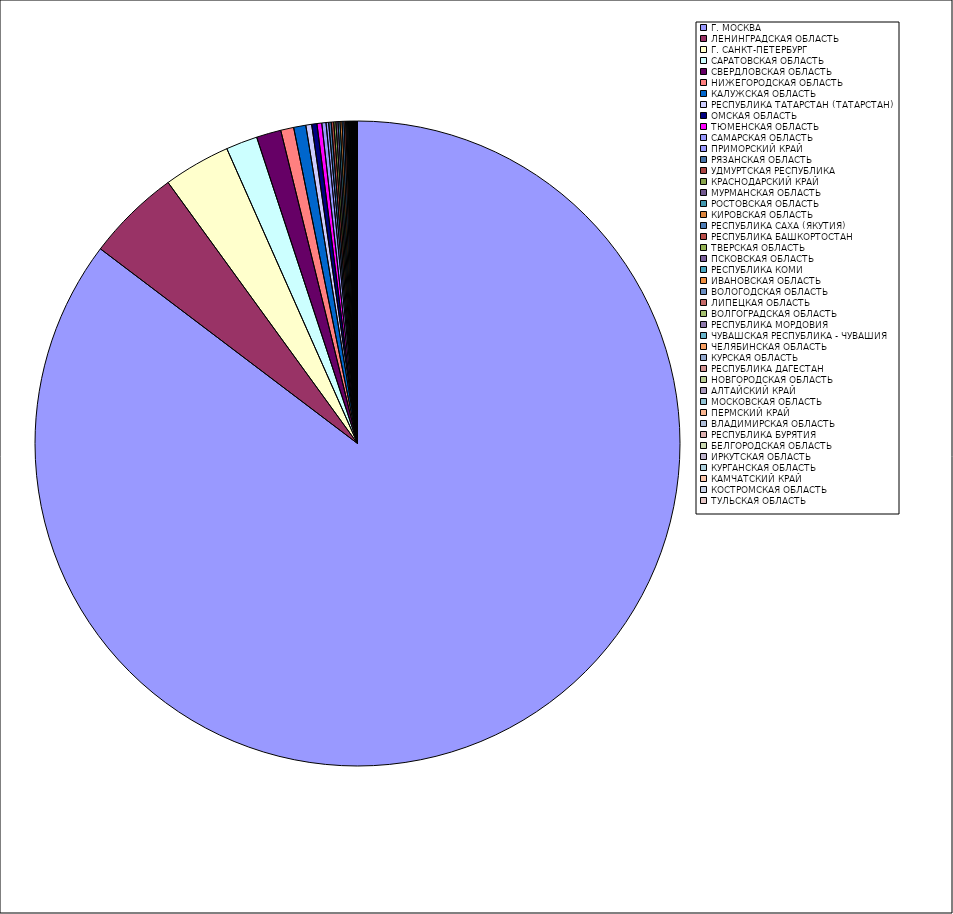
| Category | Оборот |
|---|---|
| Г. МОСКВА | 85.295 |
| ЛЕНИНГРАДСКАЯ ОБЛАСТЬ | 4.692 |
| Г. САНКТ-ПЕТЕРБУРГ | 3.353 |
| САРАТОВСКАЯ ОБЛАСТЬ | 1.578 |
| СВЕРДЛОВСКАЯ ОБЛАСТЬ | 1.235 |
| НИЖЕГОРОДСКАЯ ОБЛАСТЬ | 0.651 |
| КАЛУЖСКАЯ ОБЛАСТЬ | 0.61 |
| РЕСПУБЛИКА ТАТАРСТАН (ТАТАРСТАН) | 0.293 |
| ОМСКАЯ ОБЛАСТЬ | 0.263 |
| ТЮМЕНСКАЯ ОБЛАСТЬ | 0.24 |
| САМАРСКАЯ ОБЛАСТЬ | 0.211 |
| ПРИМОРСКИЙ КРАЙ | 0.13 |
| РЯЗАНСКАЯ ОБЛАСТЬ | 0.128 |
| УДМУРТСКАЯ РЕСПУБЛИКА | 0.125 |
| КРАСНОДАРСКИЙ КРАЙ | 0.106 |
| МУРМАНСКАЯ ОБЛАСТЬ | 0.105 |
| РОСТОВСКАЯ ОБЛАСТЬ | 0.099 |
| КИРОВСКАЯ ОБЛАСТЬ | 0.099 |
| РЕСПУБЛИКА САХА (ЯКУТИЯ) | 0.098 |
| РЕСПУБЛИКА БАШКОРТОСТАН | 0.081 |
| ТВЕРСКАЯ ОБЛАСТЬ | 0.05 |
| ПСКОВСКАЯ ОБЛАСТЬ | 0.047 |
| РЕСПУБЛИКА КОМИ | 0.045 |
| ИВАНОВСКАЯ ОБЛАСТЬ | 0.038 |
| ВОЛОГОДСКАЯ ОБЛАСТЬ | 0.035 |
| ЛИПЕЦКАЯ ОБЛАСТЬ | 0.033 |
| ВОЛГОГРАДСКАЯ ОБЛАСТЬ | 0.032 |
| РЕСПУБЛИКА МОРДОВИЯ | 0.028 |
| ЧУВАШСКАЯ РЕСПУБЛИКА - ЧУВАШИЯ | 0.027 |
| ЧЕЛЯБИНСКАЯ ОБЛАСТЬ | 0.027 |
| КУРСКАЯ ОБЛАСТЬ | 0.025 |
| РЕСПУБЛИКА ДАГЕСТАН | 0.025 |
| НОВГОРОДСКАЯ ОБЛАСТЬ | 0.022 |
| АЛТАЙСКИЙ КРАЙ | 0.022 |
| МОСКОВСКАЯ ОБЛАСТЬ | 0.02 |
| ПЕРМСКИЙ КРАЙ | 0.019 |
| ВЛАДИМИРСКАЯ ОБЛАСТЬ | 0.017 |
| РЕСПУБЛИКА БУРЯТИЯ | 0.015 |
| БЕЛГОРОДСКАЯ ОБЛАСТЬ | 0.014 |
| ИРКУТСКАЯ ОБЛАСТЬ | 0.014 |
| КУРГАНСКАЯ ОБЛАСТЬ | 0.01 |
| КАМЧАТСКИЙ КРАЙ | 0.01 |
| КОСТРОМСКАЯ ОБЛАСТЬ | 0.006 |
| ТУЛЬСКАЯ ОБЛАСТЬ | 0.006 |